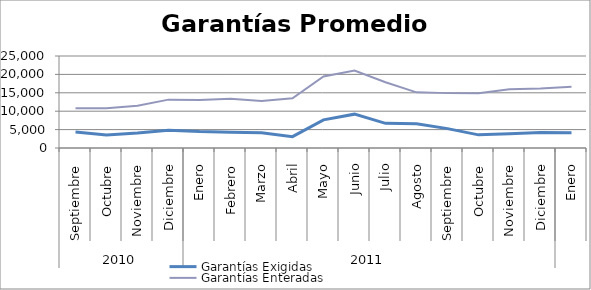
| Category | Garantías Exigidas | Garantías Enteradas |
|---|---|---|
| 0 | 4372.607 | 10829.062 |
| 1 | 3557.93 | 10787.9 |
| 2 | 4056.528 | 11463.422 |
| 3 | 4832.111 | 13142.881 |
| 4 | 4466.32 | 13061.162 |
| 5 | 4313.718 | 13357.444 |
| 6 | 4162.491 | 12796.251 |
| 7 | 3090.395 | 13495.263 |
| 8 | 7655.186 | 19416.342 |
| 9 | 9198.096 | 21035.301 |
| 10 | 6699.851 | 17866.843 |
| 11 | 6615.292 | 15119.839 |
| 12 | 5266.973 | 14911.639 |
| 13 | 3572.137 | 14861.465 |
| 14 | 3876.388 | 15976.819 |
| 15 | 4182.413 | 16147.351 |
| 16 | 4146.8 | 16662.483 |